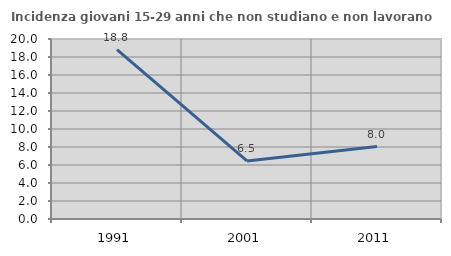
| Category | Incidenza giovani 15-29 anni che non studiano e non lavorano  |
|---|---|
| 1991.0 | 18.831 |
| 2001.0 | 6.452 |
| 2011.0 | 8.046 |